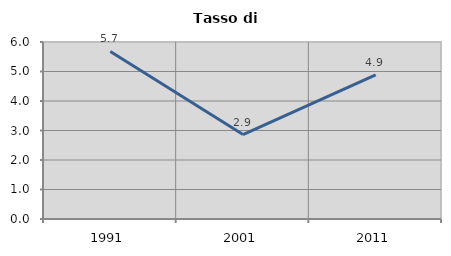
| Category | Tasso di disoccupazione   |
|---|---|
| 1991.0 | 5.681 |
| 2001.0 | 2.862 |
| 2011.0 | 4.883 |